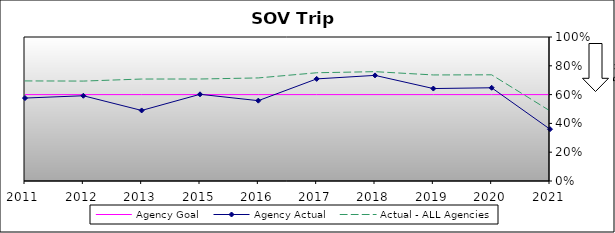
| Category | Agency Goal | Agency Actual | Actual - ALL Agencies |
|---|---|---|---|
| 2011.0 | 0.6 | 0.576 | 0.695 |
| 2012.0 | 0.6 | 0.592 | 0.694 |
| 2013.0 | 0.6 | 0.49 | 0.708 |
| 2015.0 | 0.6 | 0.602 | 0.708 |
| 2016.0 | 0.6 | 0.558 | 0.716 |
| 2017.0 | 0.6 | 0.709 | 0.752 |
| 2018.0 | 0.6 | 0.734 | 0.759 |
| 2019.0 | 0.6 | 0.642 | 0.736 |
| 2020.0 | 0.6 | 0.647 | 0.737 |
| 2021.0 | 0.6 | 0.36 | 0.487 |